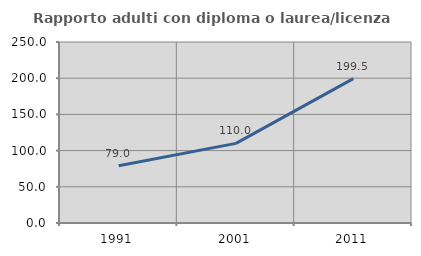
| Category | Rapporto adulti con diploma o laurea/licenza media  |
|---|---|
| 1991.0 | 78.969 |
| 2001.0 | 109.971 |
| 2011.0 | 199.497 |